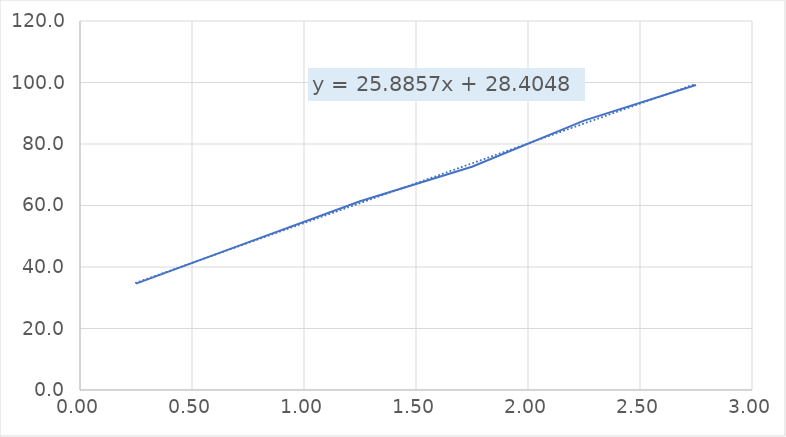
| Category | Series 0 |
|---|---|
| 0.25 | 34.6 |
| 0.75 | 48 |
| 1.25 | 61.4 |
| 1.75 | 72.6 |
| 2.25 | 87.6 |
| 2.75 | 99.2 |